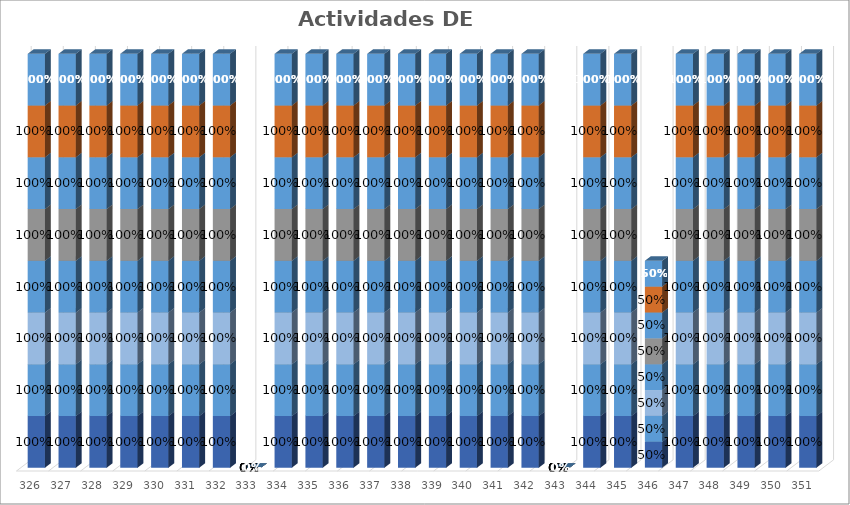
| Category | % Avance |
|---|---|
| 326.0 | 1 |
| 327.0 | 1 |
| 328.0 | 1 |
| 329.0 | 1 |
| 330.0 | 1 |
| 331.0 | 1 |
| 332.0 | 1 |
| 333.0 | 0 |
| 334.0 | 1 |
| 335.0 | 1 |
| 336.0 | 1 |
| 337.0 | 1 |
| 338.0 | 1 |
| 339.0 | 1 |
| 340.0 | 1 |
| 341.0 | 1 |
| 342.0 | 1 |
| 343.0 | 0 |
| 344.0 | 1 |
| 345.0 | 1 |
| 346.0 | 0.5 |
| 347.0 | 1 |
| 348.0 | 1 |
| 349.0 | 1 |
| 350.0 | 1 |
| 351.0 | 1 |